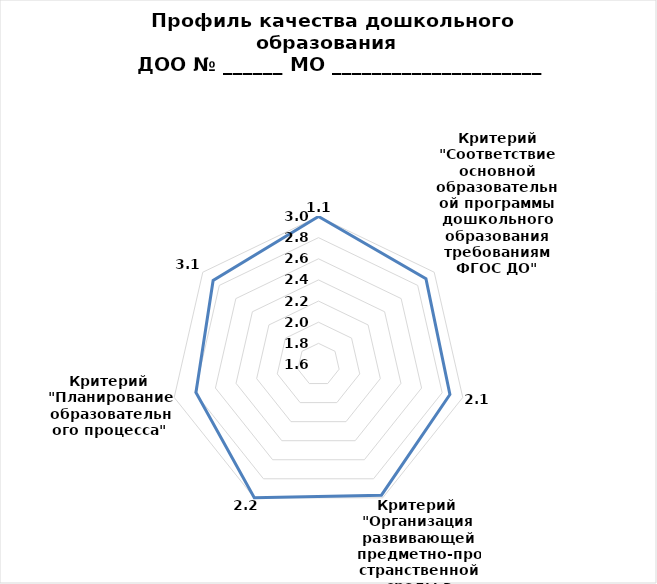
| Category | Series 0 |
|---|---|
| 0 | 3 |
| 1 | 2.9 |
| 2 | 2.875 |
| 3 | 2.972 |
| 4 | 3 |
| 5 | 2.789 |
| 6 | 2.875 |